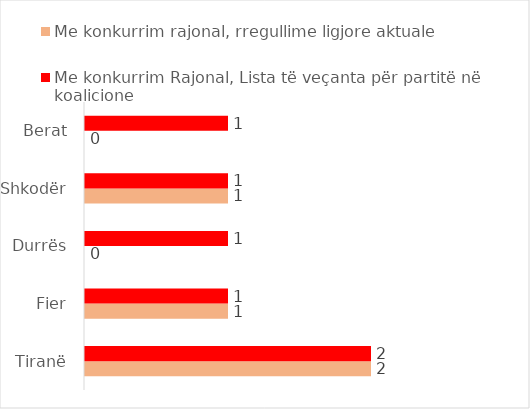
| Category | Me konkurrim rajonal, rregullime ligjore aktuale | Me konkurrim Rajonal, Lista të veçanta për partitë në koalicione |
|---|---|---|
| Tiranë | 2 | 2 |
| Fier | 1 | 1 |
| Durrës | 0 | 1 |
| Shkodër | 1 | 1 |
| Berat | 0 | 1 |